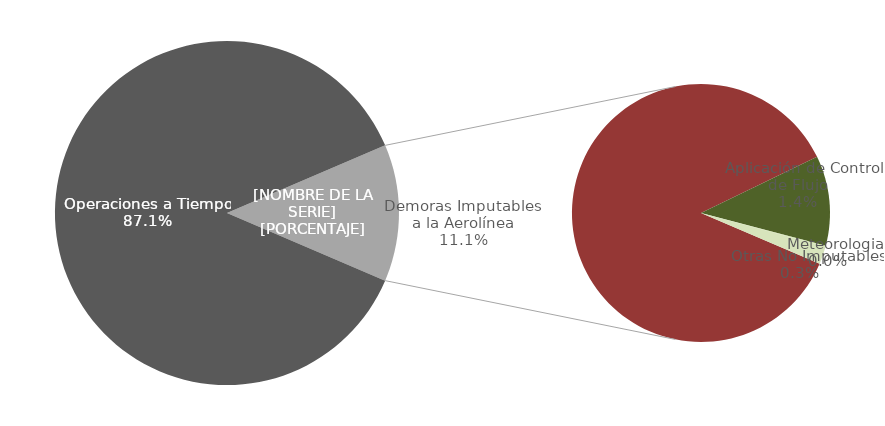
| Category | Demoras |
|---|---|
| Operaciones a Tiempo | 27022 |
| Demoras Imputables 
a la Aerolínea | 3446 |
|    Aplicación de Control 
de Flujo | 449 |
|    Repercusiones por un 
Tercero | 0 |
|    Meteorologia | 4 |
|    Otras No Imputables | 90 |